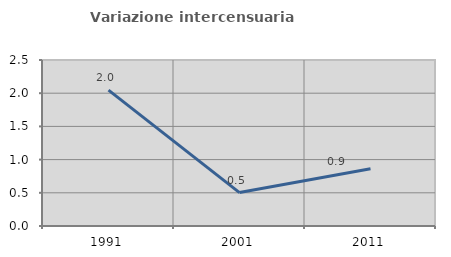
| Category | Variazione intercensuaria annua |
|---|---|
| 1991.0 | 2.045 |
| 2001.0 | 0.503 |
| 2011.0 | 0.862 |